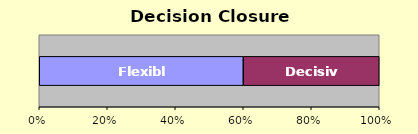
| Category | Flexible | Decisive |
|---|---|---|
| 0 | 3 | 2 |